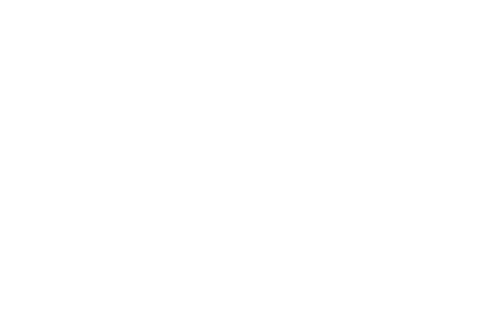
| Category | NACIONAL |
|---|---|
| 1. Invirtiendo en infraestructura inteligente | 48.093 |
| 2. Empoderando a la sociedad | 33.466 |
| 3. Desencadenando la creatividad y la innovación | 28.675 |
| 4. Creando crecimiento y empleo | 29.526 |
| IED | 34.94 |